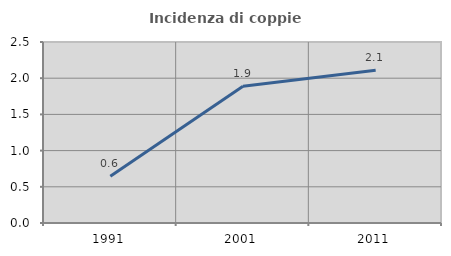
| Category | Incidenza di coppie miste |
|---|---|
| 1991.0 | 0.645 |
| 2001.0 | 1.888 |
| 2011.0 | 2.109 |